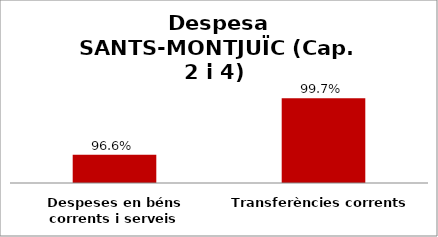
| Category | Series 0 |
|---|---|
| Despeses en béns corrents i serveis | 0.966 |
| Transferències corrents | 0.997 |